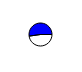
| Category | Series 0 |
|---|---|
| 0 | 4406029 |
| 1 | 4823095 |